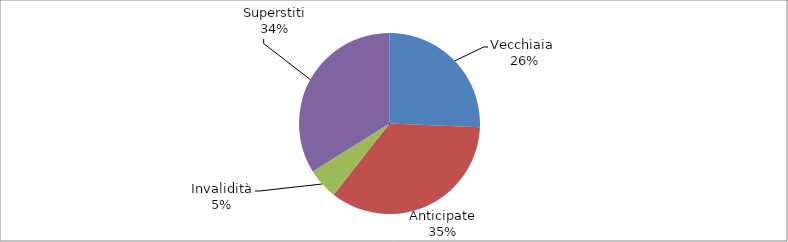
| Category | Series 0 |
|---|---|
| Vecchiaia  | 16434 |
| Anticipate | 22343 |
| Invalidità | 3539 |
| Superstiti | 21692 |